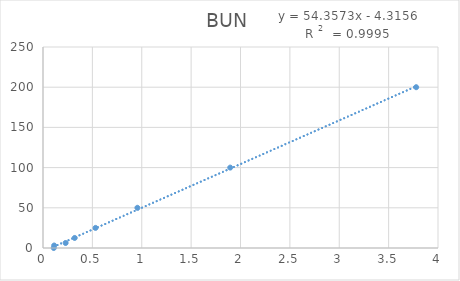
| Category | BUN |
|---|---|
| 0.109 | 0 |
| 0.113 | 3.1 |
| 0.229 | 6.2 |
| 0.321 | 12.5 |
| 0.532 | 25 |
| 0.956 | 50 |
| 1.896 | 100 |
| 3.779 | 200 |